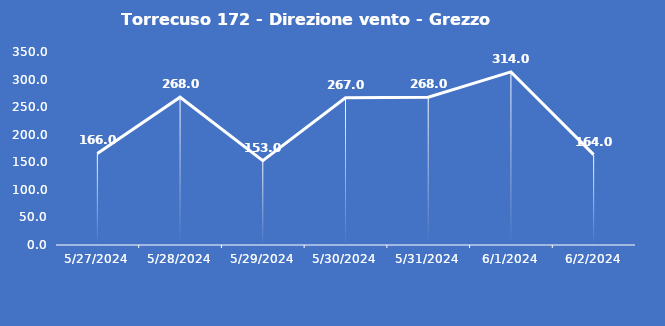
| Category | Torrecuso 172 - Direzione vento - Grezzo (°N) |
|---|---|
| 5/27/24 | 166 |
| 5/28/24 | 268 |
| 5/29/24 | 153 |
| 5/30/24 | 267 |
| 5/31/24 | 268 |
| 6/1/24 | 314 |
| 6/2/24 | 164 |